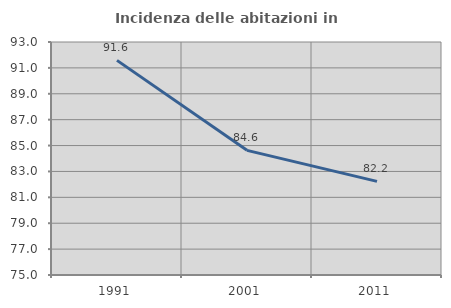
| Category | Incidenza delle abitazioni in proprietà  |
|---|---|
| 1991.0 | 91.581 |
| 2001.0 | 84.631 |
| 2011.0 | 82.234 |